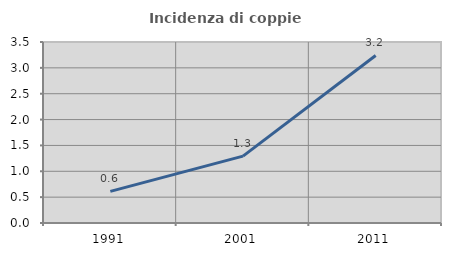
| Category | Incidenza di coppie miste |
|---|---|
| 1991.0 | 0.611 |
| 2001.0 | 1.294 |
| 2011.0 | 3.24 |